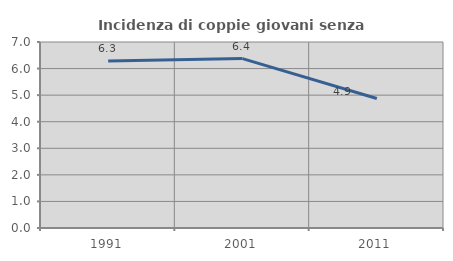
| Category | Incidenza di coppie giovani senza figli |
|---|---|
| 1991.0 | 6.288 |
| 2001.0 | 6.375 |
| 2011.0 | 4.875 |